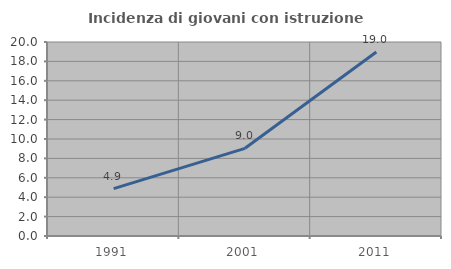
| Category | Incidenza di giovani con istruzione universitaria |
|---|---|
| 1991.0 | 4.886 |
| 2001.0 | 9.04 |
| 2011.0 | 18.966 |